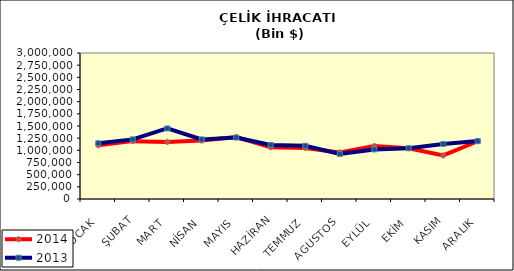
| Category | 2014 | 2013 |
|---|---|---|
| OCAK | 1105473.246 | 1144613.557 |
| ŞUBAT | 1189107.778 | 1224777.64 |
| MART | 1173025.966 | 1449849.35 |
| NİSAN | 1200660.71 | 1224394.159 |
| MAYIS | 1272871.984 | 1262960.404 |
| HAZİRAN | 1063914.917 | 1111722.759 |
| TEMMUZ | 1048756.143 | 1092640.278 |
| AGUSTOS | 957129.951 | 927133.157 |
| EYLÜL | 1087232.744 | 1018041.534 |
| EKİM | 1041551.749 | 1044197.044 |
| KASIM | 895561.079 | 1131232.413 |
| ARALIK | 1187018.331 | 1189403.212 |